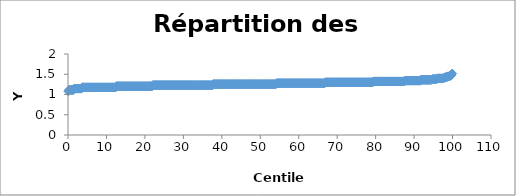
| Category | Series 0 |
|---|---|
| 0.0946969696969697 | 1.079 |
| 0.28409090909090906 | 1.114 |
| 0.4734848484848485 | 1.114 |
| 0.6628787878787878 | 1.114 |
| 0.8522727272727273 | 1.114 |
| 1.0416666666666667 | 1.114 |
| 1.231060606060606 | 1.114 |
| 1.4204545454545454 | 1.114 |
| 1.6098484848484849 | 1.146 |
| 1.7992424242424243 | 1.146 |
| 1.9886363636363638 | 1.146 |
| 2.178030303030303 | 1.146 |
| 2.367424242424242 | 1.146 |
| 2.5568181818181817 | 1.146 |
| 2.746212121212121 | 1.146 |
| 2.9356060606060606 | 1.146 |
| 3.125 | 1.146 |
| 3.3143939393939394 | 1.146 |
| 3.503787878787879 | 1.146 |
| 3.6931818181818183 | 1.176 |
| 3.882575757575758 | 1.176 |
| 4.071969696969696 | 1.176 |
| 4.261363636363637 | 1.176 |
| 4.450757575757576 | 1.176 |
| 4.640151515151515 | 1.176 |
| 4.829545454545454 | 1.176 |
| 5.018939393939394 | 1.176 |
| 5.208333333333333 | 1.176 |
| 5.3977272727272725 | 1.176 |
| 5.587121212121212 | 1.176 |
| 5.776515151515151 | 1.176 |
| 5.965909090909091 | 1.176 |
| 6.15530303030303 | 1.176 |
| 6.34469696969697 | 1.176 |
| 6.534090909090909 | 1.176 |
| 6.723484848484849 | 1.176 |
| 6.912878787878788 | 1.176 |
| 7.1022727272727275 | 1.176 |
| 7.291666666666667 | 1.176 |
| 7.481060606060606 | 1.176 |
| 7.670454545454546 | 1.176 |
| 7.859848484848484 | 1.176 |
| 8.049242424242424 | 1.176 |
| 8.238636363636363 | 1.176 |
| 8.428030303030303 | 1.176 |
| 8.617424242424242 | 1.176 |
| 8.806818181818182 | 1.176 |
| 8.996212121212121 | 1.176 |
| 9.185606060606059 | 1.176 |
| 9.374999999999998 | 1.176 |
| 9.564393939393938 | 1.176 |
| 9.753787878787877 | 1.176 |
| 9.943181818181817 | 1.176 |
| 10.132575757575756 | 1.176 |
| 10.321969696969695 | 1.176 |
| 10.511363636363635 | 1.176 |
| 10.700757575757574 | 1.176 |
| 10.890151515151514 | 1.176 |
| 11.079545454545453 | 1.176 |
| 11.268939393939393 | 1.176 |
| 11.458333333333332 | 1.176 |
| 11.647727272727272 | 1.176 |
| 11.837121212121211 | 1.176 |
| 12.02651515151515 | 1.176 |
| 12.21590909090909 | 1.176 |
| 12.40530303030303 | 1.176 |
| 12.594696969696969 | 1.204 |
| 12.784090909090908 | 1.204 |
| 12.973484848484848 | 1.204 |
| 13.162878787878787 | 1.204 |
| 13.352272727272727 | 1.204 |
| 13.541666666666666 | 1.204 |
| 13.731060606060606 | 1.204 |
| 13.920454545454545 | 1.204 |
| 14.109848484848484 | 1.204 |
| 14.299242424242424 | 1.204 |
| 14.488636363636363 | 1.204 |
| 14.678030303030303 | 1.204 |
| 14.867424242424242 | 1.204 |
| 15.056818181818182 | 1.204 |
| 15.246212121212121 | 1.204 |
| 15.435606060606059 | 1.204 |
| 15.624999999999998 | 1.204 |
| 15.814393939393938 | 1.204 |
| 16.00378787878788 | 1.204 |
| 16.193181818181817 | 1.204 |
| 16.382575757575758 | 1.204 |
| 16.571969696969695 | 1.204 |
| 16.761363636363637 | 1.204 |
| 16.950757575757574 | 1.204 |
| 17.140151515151516 | 1.204 |
| 17.329545454545453 | 1.204 |
| 17.518939393939394 | 1.204 |
| 17.708333333333332 | 1.204 |
| 17.897727272727273 | 1.204 |
| 18.08712121212121 | 1.204 |
| 18.27651515151515 | 1.204 |
| 18.46590909090909 | 1.204 |
| 18.655303030303028 | 1.204 |
| 18.84469696969697 | 1.204 |
| 19.034090909090907 | 1.204 |
| 19.223484848484848 | 1.204 |
| 19.412878787878785 | 1.204 |
| 19.602272727272727 | 1.204 |
| 19.791666666666664 | 1.204 |
| 19.981060606060606 | 1.204 |
| 20.170454545454543 | 1.204 |
| 20.359848484848484 | 1.204 |
| 20.549242424242422 | 1.204 |
| 20.738636363636363 | 1.204 |
| 20.9280303030303 | 1.204 |
| 21.117424242424242 | 1.204 |
| 21.30681818181818 | 1.204 |
| 21.49621212121212 | 1.204 |
| 21.68560606060606 | 1.204 |
| 21.875 | 1.204 |
| 22.064393939393938 | 1.23 |
| 22.25378787878788 | 1.23 |
| 22.443181818181817 | 1.23 |
| 22.632575757575758 | 1.23 |
| 22.821969696969695 | 1.23 |
| 23.011363636363637 | 1.23 |
| 23.200757575757574 | 1.23 |
| 23.390151515151516 | 1.23 |
| 23.579545454545453 | 1.23 |
| 23.768939393939394 | 1.23 |
| 23.958333333333332 | 1.23 |
| 24.147727272727273 | 1.23 |
| 24.33712121212121 | 1.23 |
| 24.52651515151515 | 1.23 |
| 24.71590909090909 | 1.23 |
| 24.905303030303028 | 1.23 |
| 25.09469696969697 | 1.23 |
| 25.284090909090907 | 1.23 |
| 25.473484848484848 | 1.23 |
| 25.662878787878785 | 1.23 |
| 25.852272727272727 | 1.23 |
| 26.041666666666664 | 1.23 |
| 26.231060606060606 | 1.23 |
| 26.420454545454543 | 1.23 |
| 26.609848484848484 | 1.23 |
| 26.799242424242422 | 1.23 |
| 26.988636363636363 | 1.23 |
| 27.1780303030303 | 1.23 |
| 27.367424242424242 | 1.23 |
| 27.55681818181818 | 1.23 |
| 27.74621212121212 | 1.23 |
| 27.93560606060606 | 1.23 |
| 28.125 | 1.23 |
| 28.314393939393938 | 1.23 |
| 28.50378787878788 | 1.23 |
| 28.693181818181817 | 1.23 |
| 28.882575757575758 | 1.23 |
| 29.071969696969695 | 1.23 |
| 29.261363636363637 | 1.23 |
| 29.450757575757574 | 1.23 |
| 29.640151515151516 | 1.23 |
| 29.829545454545453 | 1.23 |
| 30.018939393939394 | 1.23 |
| 30.208333333333332 | 1.23 |
| 30.397727272727273 | 1.23 |
| 30.58712121212121 | 1.23 |
| 30.77651515151515 | 1.23 |
| 30.96590909090909 | 1.23 |
| 31.155303030303028 | 1.23 |
| 31.34469696969697 | 1.23 |
| 31.534090909090907 | 1.23 |
| 31.723484848484848 | 1.23 |
| 31.912878787878785 | 1.23 |
| 32.10227272727273 | 1.23 |
| 32.291666666666664 | 1.23 |
| 32.4810606060606 | 1.23 |
| 32.67045454545455 | 1.23 |
| 32.859848484848484 | 1.23 |
| 33.04924242424242 | 1.23 |
| 33.23863636363636 | 1.23 |
| 33.428030303030305 | 1.23 |
| 33.61742424242424 | 1.23 |
| 33.80681818181818 | 1.23 |
| 33.99621212121212 | 1.23 |
| 34.18560606060606 | 1.23 |
| 34.375 | 1.23 |
| 34.56439393939394 | 1.23 |
| 34.753787878787875 | 1.23 |
| 34.94318181818182 | 1.23 |
| 35.13257575757576 | 1.23 |
| 35.321969696969695 | 1.23 |
| 35.51136363636363 | 1.23 |
| 35.70075757575758 | 1.23 |
| 35.890151515151516 | 1.23 |
| 36.07954545454545 | 1.23 |
| 36.26893939393939 | 1.23 |
| 36.45833333333333 | 1.23 |
| 36.64772727272727 | 1.23 |
| 36.83712121212121 | 1.23 |
| 37.02651515151515 | 1.23 |
| 37.215909090909086 | 1.23 |
| 37.40530303030303 | 1.23 |
| 37.59469696969697 | 1.23 |
| 37.78409090909091 | 1.255 |
| 37.973484848484844 | 1.255 |
| 38.16287878787879 | 1.255 |
| 38.35227272727273 | 1.255 |
| 38.541666666666664 | 1.255 |
| 38.7310606060606 | 1.255 |
| 38.92045454545455 | 1.255 |
| 39.109848484848484 | 1.255 |
| 39.29924242424242 | 1.255 |
| 39.48863636363636 | 1.255 |
| 39.678030303030305 | 1.255 |
| 39.86742424242424 | 1.255 |
| 40.05681818181818 | 1.255 |
| 40.24621212121212 | 1.255 |
| 40.43560606060606 | 1.255 |
| 40.625 | 1.255 |
| 40.81439393939394 | 1.255 |
| 41.003787878787875 | 1.255 |
| 41.19318181818182 | 1.255 |
| 41.38257575757576 | 1.255 |
| 41.571969696969695 | 1.255 |
| 41.76136363636363 | 1.255 |
| 41.95075757575758 | 1.255 |
| 42.140151515151516 | 1.255 |
| 42.32954545454545 | 1.255 |
| 42.51893939393939 | 1.255 |
| 42.70833333333333 | 1.255 |
| 42.89772727272727 | 1.255 |
| 43.08712121212121 | 1.255 |
| 43.27651515151515 | 1.255 |
| 43.465909090909086 | 1.255 |
| 43.65530303030303 | 1.255 |
| 43.84469696969697 | 1.255 |
| 44.03409090909091 | 1.255 |
| 44.223484848484844 | 1.255 |
| 44.41287878787879 | 1.255 |
| 44.60227272727273 | 1.255 |
| 44.791666666666664 | 1.255 |
| 44.9810606060606 | 1.255 |
| 45.17045454545455 | 1.255 |
| 45.359848484848484 | 1.255 |
| 45.54924242424242 | 1.255 |
| 45.73863636363636 | 1.255 |
| 45.928030303030305 | 1.255 |
| 46.11742424242424 | 1.255 |
| 46.30681818181818 | 1.255 |
| 46.49621212121212 | 1.255 |
| 46.68560606060606 | 1.255 |
| 46.875 | 1.255 |
| 47.06439393939394 | 1.255 |
| 47.253787878787875 | 1.255 |
| 47.44318181818182 | 1.255 |
| 47.63257575757576 | 1.255 |
| 47.821969696969695 | 1.255 |
| 48.01136363636363 | 1.255 |
| 48.20075757575758 | 1.255 |
| 48.390151515151516 | 1.255 |
| 48.57954545454545 | 1.255 |
| 48.76893939393939 | 1.255 |
| 48.95833333333333 | 1.255 |
| 49.14772727272727 | 1.255 |
| 49.33712121212121 | 1.255 |
| 49.52651515151515 | 1.255 |
| 49.715909090909086 | 1.255 |
| 49.90530303030303 | 1.255 |
| 50.09469696969697 | 1.255 |
| 50.28409090909091 | 1.255 |
| 50.473484848484844 | 1.255 |
| 50.66287878787879 | 1.255 |
| 50.85227272727273 | 1.255 |
| 51.041666666666664 | 1.255 |
| 51.2310606060606 | 1.255 |
| 51.42045454545455 | 1.255 |
| 51.609848484848484 | 1.255 |
| 51.79924242424242 | 1.255 |
| 51.98863636363636 | 1.255 |
| 52.178030303030305 | 1.255 |
| 52.36742424242424 | 1.255 |
| 52.55681818181818 | 1.255 |
| 52.74621212121212 | 1.255 |
| 52.93560606060606 | 1.255 |
| 53.125 | 1.255 |
| 53.31439393939394 | 1.255 |
| 53.503787878787875 | 1.255 |
| 53.69318181818182 | 1.255 |
| 53.88257575757576 | 1.255 |
| 54.071969696969695 | 1.255 |
| 54.26136363636363 | 1.279 |
| 54.45075757575758 | 1.279 |
| 54.640151515151516 | 1.279 |
| 54.82954545454545 | 1.279 |
| 55.01893939393939 | 1.279 |
| 55.20833333333333 | 1.279 |
| 55.39772727272727 | 1.279 |
| 55.58712121212121 | 1.279 |
| 55.77651515151515 | 1.279 |
| 55.965909090909086 | 1.279 |
| 56.15530303030303 | 1.279 |
| 56.34469696969697 | 1.279 |
| 56.53409090909091 | 1.279 |
| 56.723484848484844 | 1.279 |
| 56.91287878787879 | 1.279 |
| 57.10227272727273 | 1.279 |
| 57.291666666666664 | 1.279 |
| 57.4810606060606 | 1.279 |
| 57.67045454545455 | 1.279 |
| 57.859848484848484 | 1.279 |
| 58.04924242424242 | 1.279 |
| 58.23863636363636 | 1.279 |
| 58.428030303030305 | 1.279 |
| 58.61742424242424 | 1.279 |
| 58.80681818181818 | 1.279 |
| 58.99621212121212 | 1.279 |
| 59.18560606060606 | 1.279 |
| 59.375 | 1.279 |
| 59.56439393939394 | 1.279 |
| 59.753787878787875 | 1.279 |
| 59.94318181818182 | 1.279 |
| 60.13257575757576 | 1.279 |
| 60.321969696969695 | 1.279 |
| 60.51136363636363 | 1.279 |
| 60.70075757575758 | 1.279 |
| 60.890151515151516 | 1.279 |
| 61.07954545454545 | 1.279 |
| 61.26893939393939 | 1.279 |
| 61.45833333333333 | 1.279 |
| 61.64772727272727 | 1.279 |
| 61.83712121212121 | 1.279 |
| 62.02651515151515 | 1.279 |
| 62.215909090909086 | 1.279 |
| 62.40530303030303 | 1.279 |
| 62.59469696969697 | 1.279 |
| 62.78409090909091 | 1.279 |
| 62.973484848484844 | 1.279 |
| 63.16287878787879 | 1.279 |
| 63.35227272727273 | 1.279 |
| 63.541666666666664 | 1.279 |
| 63.7310606060606 | 1.279 |
| 63.92045454545455 | 1.279 |
| 64.10984848484848 | 1.279 |
| 64.29924242424242 | 1.279 |
| 64.48863636363636 | 1.279 |
| 64.6780303030303 | 1.279 |
| 64.86742424242424 | 1.279 |
| 65.05681818181819 | 1.279 |
| 65.24621212121212 | 1.279 |
| 65.43560606060606 | 1.279 |
| 65.625 | 1.279 |
| 65.81439393939394 | 1.279 |
| 66.00378787878788 | 1.279 |
| 66.19318181818181 | 1.279 |
| 66.38257575757575 | 1.279 |
| 66.5719696969697 | 1.279 |
| 66.76136363636364 | 1.279 |
| 66.95075757575758 | 1.301 |
| 67.14015151515152 | 1.301 |
| 67.32954545454545 | 1.301 |
| 67.51893939393939 | 1.301 |
| 67.70833333333333 | 1.301 |
| 67.89772727272727 | 1.301 |
| 68.0871212121212 | 1.301 |
| 68.27651515151516 | 1.301 |
| 68.4659090909091 | 1.301 |
| 68.65530303030303 | 1.301 |
| 68.84469696969697 | 1.301 |
| 69.0340909090909 | 1.301 |
| 69.22348484848484 | 1.301 |
| 69.41287878787878 | 1.301 |
| 69.60227272727272 | 1.301 |
| 69.79166666666667 | 1.301 |
| 69.98106060606061 | 1.301 |
| 70.17045454545455 | 1.301 |
| 70.35984848484848 | 1.301 |
| 70.54924242424242 | 1.301 |
| 70.73863636363636 | 1.301 |
| 70.9280303030303 | 1.301 |
| 71.11742424242424 | 1.301 |
| 71.30681818181819 | 1.301 |
| 71.49621212121212 | 1.301 |
| 71.68560606060606 | 1.301 |
| 71.875 | 1.301 |
| 72.06439393939394 | 1.301 |
| 72.25378787878788 | 1.301 |
| 72.44318181818181 | 1.301 |
| 72.63257575757575 | 1.301 |
| 72.82196969696969 | 1.301 |
| 73.01136363636364 | 1.301 |
| 73.20075757575758 | 1.301 |
| 73.39015151515152 | 1.301 |
| 73.57954545454545 | 1.301 |
| 73.76893939393939 | 1.301 |
| 73.95833333333333 | 1.301 |
| 74.14772727272727 | 1.301 |
| 74.3371212121212 | 1.301 |
| 74.52651515151516 | 1.301 |
| 74.7159090909091 | 1.301 |
| 74.90530303030303 | 1.301 |
| 75.09469696969697 | 1.301 |
| 75.2840909090909 | 1.301 |
| 75.47348484848484 | 1.301 |
| 75.66287878787878 | 1.301 |
| 75.85227272727272 | 1.301 |
| 76.04166666666667 | 1.301 |
| 76.23106060606061 | 1.301 |
| 76.42045454545455 | 1.301 |
| 76.60984848484848 | 1.301 |
| 76.79924242424242 | 1.301 |
| 76.98863636363636 | 1.301 |
| 77.1780303030303 | 1.301 |
| 77.36742424242424 | 1.301 |
| 77.55681818181819 | 1.301 |
| 77.74621212121212 | 1.301 |
| 77.93560606060606 | 1.301 |
| 78.125 | 1.301 |
| 78.31439393939394 | 1.301 |
| 78.50378787878788 | 1.301 |
| 78.69318181818181 | 1.301 |
| 78.88257575757575 | 1.301 |
| 79.07196969696969 | 1.301 |
| 79.26136363636364 | 1.301 |
| 79.45075757575758 | 1.322 |
| 79.64015151515152 | 1.322 |
| 79.82954545454545 | 1.322 |
| 80.01893939393939 | 1.322 |
| 80.20833333333333 | 1.322 |
| 80.39772727272727 | 1.322 |
| 80.5871212121212 | 1.322 |
| 80.77651515151516 | 1.322 |
| 80.9659090909091 | 1.322 |
| 81.15530303030303 | 1.322 |
| 81.34469696969697 | 1.322 |
| 81.5340909090909 | 1.322 |
| 81.72348484848484 | 1.322 |
| 81.91287878787878 | 1.322 |
| 82.10227272727272 | 1.322 |
| 82.29166666666667 | 1.322 |
| 82.48106060606061 | 1.322 |
| 82.67045454545455 | 1.322 |
| 82.85984848484848 | 1.322 |
| 83.04924242424242 | 1.322 |
| 83.23863636363636 | 1.322 |
| 83.4280303030303 | 1.322 |
| 83.61742424242424 | 1.322 |
| 83.80681818181819 | 1.322 |
| 83.99621212121212 | 1.322 |
| 84.18560606060606 | 1.322 |
| 84.375 | 1.322 |
| 84.56439393939394 | 1.322 |
| 84.75378787878788 | 1.322 |
| 84.94318181818181 | 1.322 |
| 85.13257575757575 | 1.322 |
| 85.32196969696969 | 1.322 |
| 85.51136363636364 | 1.322 |
| 85.70075757575758 | 1.322 |
| 85.89015151515152 | 1.322 |
| 86.07954545454545 | 1.322 |
| 86.26893939393939 | 1.322 |
| 86.45833333333333 | 1.322 |
| 86.64772727272727 | 1.322 |
| 86.8371212121212 | 1.322 |
| 87.02651515151516 | 1.322 |
| 87.2159090909091 | 1.322 |
| 87.40530303030303 | 1.322 |
| 87.59469696969697 | 1.342 |
| 87.7840909090909 | 1.342 |
| 87.97348484848484 | 1.342 |
| 88.16287878787878 | 1.342 |
| 88.35227272727272 | 1.342 |
| 88.54166666666667 | 1.342 |
| 88.73106060606061 | 1.342 |
| 88.92045454545455 | 1.342 |
| 89.10984848484848 | 1.342 |
| 89.29924242424242 | 1.342 |
| 89.48863636363636 | 1.342 |
| 89.6780303030303 | 1.342 |
| 89.86742424242424 | 1.342 |
| 90.05681818181819 | 1.342 |
| 90.24621212121212 | 1.342 |
| 90.43560606060606 | 1.342 |
| 90.625 | 1.342 |
| 90.81439393939394 | 1.342 |
| 91.00378787878788 | 1.342 |
| 91.19318181818181 | 1.342 |
| 91.38257575757575 | 1.342 |
| 91.57196969696969 | 1.342 |
| 91.76136363636364 | 1.362 |
| 91.95075757575758 | 1.362 |
| 92.14015151515152 | 1.362 |
| 92.32954545454545 | 1.362 |
| 92.51893939393939 | 1.362 |
| 92.70833333333333 | 1.362 |
| 92.89772727272727 | 1.362 |
| 93.0871212121212 | 1.362 |
| 93.27651515151516 | 1.362 |
| 93.4659090909091 | 1.362 |
| 93.65530303030303 | 1.362 |
| 93.84469696969697 | 1.362 |
| 94.0340909090909 | 1.362 |
| 94.22348484848484 | 1.362 |
| 94.41287878787878 | 1.362 |
| 94.60227272727272 | 1.369 |
| 94.79166666666667 | 1.38 |
| 94.98106060606061 | 1.38 |
| 95.17045454545455 | 1.38 |
| 95.35984848484848 | 1.38 |
| 95.54924242424242 | 1.38 |
| 95.73863636363636 | 1.38 |
| 95.9280303030303 | 1.38 |
| 96.11742424242424 | 1.398 |
| 96.30681818181819 | 1.398 |
| 96.49621212121212 | 1.398 |
| 96.68560606060606 | 1.398 |
| 96.875 | 1.398 |
| 97.06439393939394 | 1.398 |
| 97.25378787878788 | 1.398 |
| 97.44318181818181 | 1.398 |
| 97.63257575757575 | 1.407 |
| 97.82196969696969 | 1.415 |
| 98.01136363636364 | 1.415 |
| 98.20075757575758 | 1.431 |
| 98.39015151515152 | 1.431 |
| 98.57954545454545 | 1.431 |
| 98.76893939393939 | 1.447 |
| 98.95833333333333 | 1.447 |
| 99.14772727272727 | 1.447 |
| 99.3371212121212 | 1.462 |
| 99.52651515151516 | 1.465 |
| 99.7159090909091 | 1.477 |
| 99.90530303030303 | 1.519 |